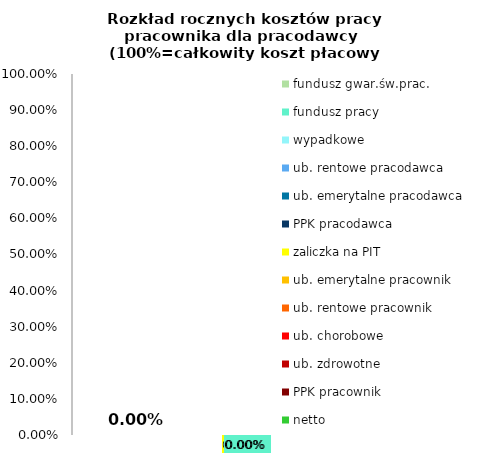
| Category | netto | PPK pracownik | ub. zdrowotne | ub. chorobowe | ub. rentowe pracownik | ub. emerytalne pracownik | zaliczka na PIT | PPK pracodawca | ub. emerytalne pracodawca | ub. rentowe pracodawca | wypadkowe | fundusz pracy | fundusz gwar.św.prac. |
|---|---|---|---|---|---|---|---|---|---|---|---|---|---|
| 0 | 0 | 0 | 0 | 0 | 0 | 0 | 0 | 0 | 0 | 0 | 0 | 0 | 0 |